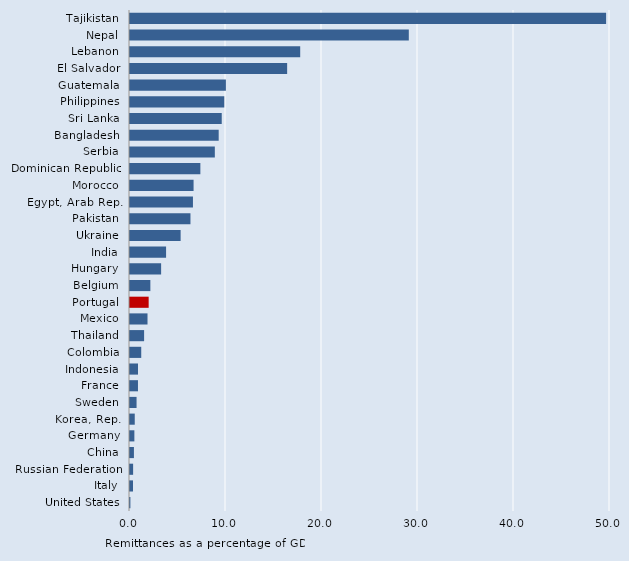
| Category | Series 0 |
|---|---|
| Tajikistan | 49.594 |
| Nepal | 29.042 |
| Lebanon | 17.73 |
| El Salvador | 16.369 |
| Guatemala | 9.989 |
| Philippines | 9.82 |
| Sri Lanka | 9.556 |
| Bangladesh | 9.239 |
| Serbia | 8.837 |
| Dominican Republic | 7.329 |
| Morocco | 6.622 |
| Egypt, Arab Rep. | 6.557 |
| Pakistan | 6.298 |
| Ukraine | 5.274 |
| India | 3.758 |
| Hungary | 3.242 |
| Belgium | 2.121 |
| Portugal | 1.944 |
| Mexico | 1.824 |
| Thailand | 1.469 |
| Colombia | 1.171 |
| Indonesia | 0.836 |
| France | 0.83 |
| Sweden | 0.683 |
| Korea, Rep. | 0.494 |
| Germany | 0.455 |
| China | 0.409 |
| Russian Federation | 0.325 |
| Italy | 0.311 |
| United States | 0.04 |